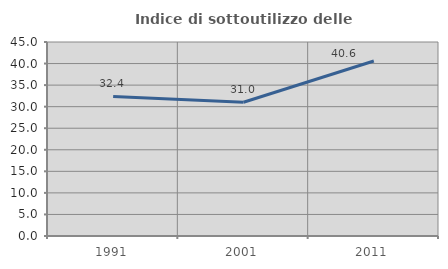
| Category | Indice di sottoutilizzo delle abitazioni  |
|---|---|
| 1991.0 | 32.363 |
| 2001.0 | 31.03 |
| 2011.0 | 40.605 |